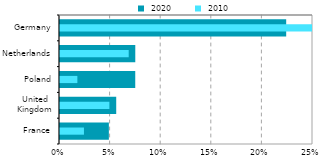
| Category |  2020 |
|---|---|
| France | 0.048 |
| United
Kingdom | 0.056 |
| Poland | 0.074 |
| Netherlands | 0.074 |
| Germany | 0.224 |